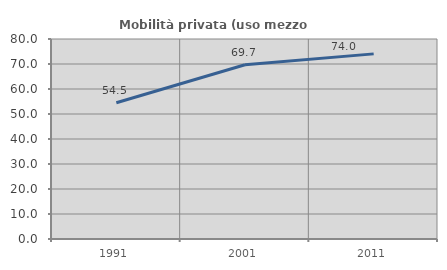
| Category | Mobilità privata (uso mezzo privato) |
|---|---|
| 1991.0 | 54.483 |
| 2001.0 | 69.676 |
| 2011.0 | 74.048 |